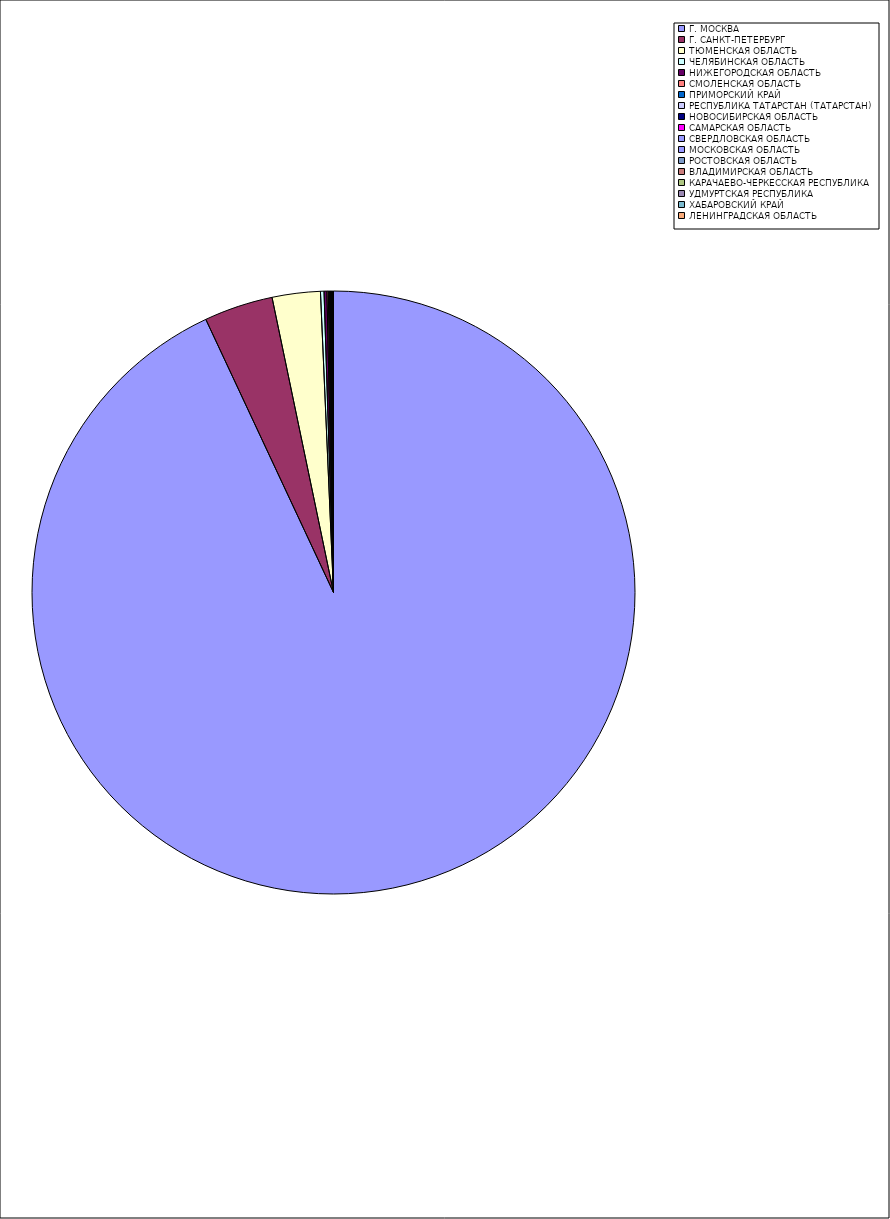
| Category | Оборот |
|---|---|
| Г. МОСКВА | 92.984 |
| Г. САНКТ-ПЕТЕРБУРГ | 3.689 |
| ТЮМЕНСКАЯ ОБЛАСТЬ | 2.578 |
| ЧЕЛЯБИНСКАЯ ОБЛАСТЬ | 0.19 |
| НИЖЕГОРОДСКАЯ ОБЛАСТЬ | 0.15 |
| СМОЛЕНСКАЯ ОБЛАСТЬ | 0.074 |
| ПРИМОРСКИЙ КРАЙ | 0.059 |
| РЕСПУБЛИКА ТАТАРСТАН (ТАТАРСТАН) | 0.034 |
| НОВОСИБИРСКАЯ ОБЛАСТЬ | 0.032 |
| САМАРСКАЯ ОБЛАСТЬ | 0.031 |
| СВЕРДЛОВСКАЯ ОБЛАСТЬ | 0.026 |
| МОСКОВСКАЯ ОБЛАСТЬ | 0.025 |
| РОСТОВСКАЯ ОБЛАСТЬ | 0.022 |
| ВЛАДИМИРСКАЯ ОБЛАСТЬ | 0.011 |
| КАРАЧАЕВО-ЧЕРКЕССКАЯ РЕСПУБЛИКА | 0.01 |
| УДМУРТСКАЯ РЕСПУБЛИКА | 0.01 |
| ХАБАРОВСКИЙ КРАЙ | 0.008 |
| ЛЕНИНГРАДСКАЯ ОБЛАСТЬ | 0.007 |